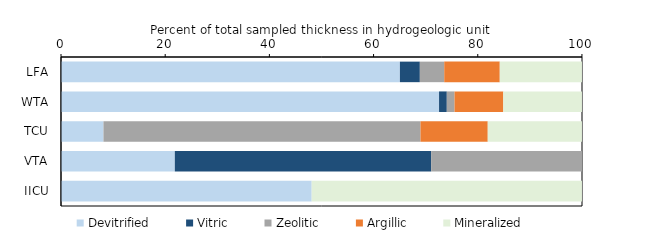
| Category | Devitrified | Vitric | Zeolitic | Argillic | dummy | Mineralized |
|---|---|---|---|---|---|---|
| LFA | 65.056 | 3.826 | 4.683 | 10.66 | 0 | 15.775 |
| WTA | 72.569 | 1.489 | 1.482 | 9.359 | 0 | 15.102 |
| TCU | 8.153 | 0 | 60.855 | 12.91 | 0 | 18.082 |
| VTA | 21.849 | 49.207 | 28.945 | 0 | 0 | 0 |
| IICU | 48.122 | 0 | 0 | 0 | 0 | 51.878 |